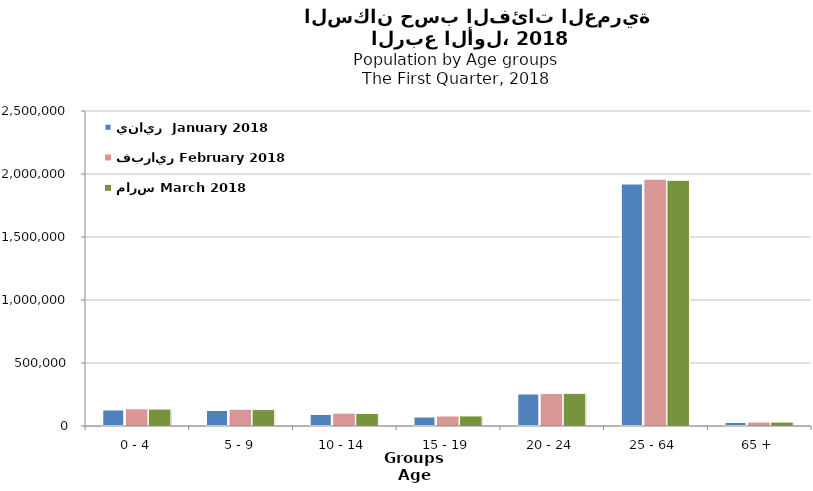
| Category | يناير  January 2018 | فبراير February 2018  | مارس March 2018  |
|---|---|---|---|
| 0 - 4 | 131592 | 136518 | 134440 |
| 5 - 9 | 126746 | 133592 | 130337 |
| 10 - 14 | 95947 | 101967 | 99697 |
| 15 - 19 | 75311 | 79168 | 79793 |
| 20 - 24 | 258450 | 258530 | 259397 |
| 25 - 64 | 1924487 | 1958910 | 1949935 |
| 65 + | 31194 | 31705 | 31454 |